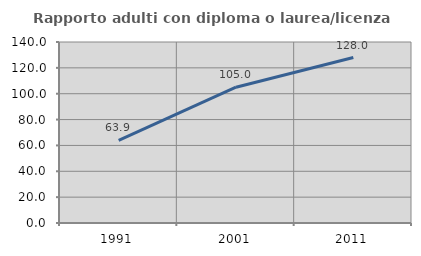
| Category | Rapporto adulti con diploma o laurea/licenza media  |
|---|---|
| 1991.0 | 63.944 |
| 2001.0 | 105.016 |
| 2011.0 | 127.953 |